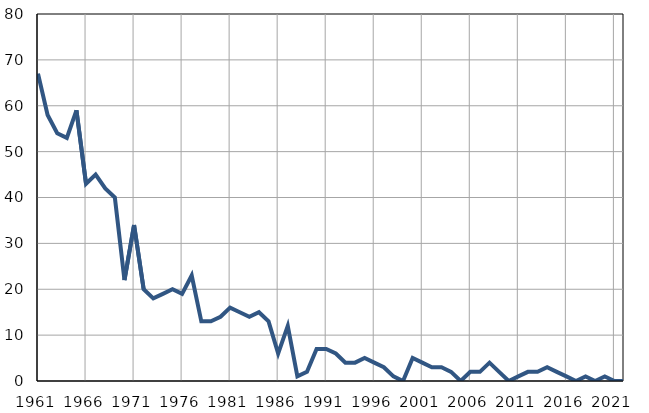
| Category | Infants
deaths |
|---|---|
| 1961.0 | 67 |
| 1962.0 | 58 |
| 1963.0 | 54 |
| 1964.0 | 53 |
| 1965.0 | 59 |
| 1966.0 | 43 |
| 1967.0 | 45 |
| 1968.0 | 42 |
| 1969.0 | 40 |
| 1970.0 | 22 |
| 1971.0 | 34 |
| 1972.0 | 20 |
| 1973.0 | 18 |
| 1974.0 | 19 |
| 1975.0 | 20 |
| 1976.0 | 19 |
| 1977.0 | 23 |
| 1978.0 | 13 |
| 1979.0 | 13 |
| 1980.0 | 14 |
| 1981.0 | 16 |
| 1982.0 | 15 |
| 1983.0 | 14 |
| 1984.0 | 15 |
| 1985.0 | 13 |
| 1986.0 | 6 |
| 1987.0 | 12 |
| 1988.0 | 1 |
| 1989.0 | 2 |
| 1990.0 | 7 |
| 1991.0 | 7 |
| 1992.0 | 6 |
| 1993.0 | 4 |
| 1994.0 | 4 |
| 1995.0 | 5 |
| 1996.0 | 4 |
| 1997.0 | 3 |
| 1998.0 | 1 |
| 1999.0 | 0 |
| 2000.0 | 5 |
| 2001.0 | 4 |
| 2002.0 | 3 |
| 2003.0 | 3 |
| 2004.0 | 2 |
| 2005.0 | 0 |
| 2006.0 | 2 |
| 2007.0 | 2 |
| 2008.0 | 4 |
| 2009.0 | 2 |
| 2010.0 | 0 |
| 2011.0 | 1 |
| 2012.0 | 2 |
| 2013.0 | 2 |
| 2014.0 | 3 |
| 2015.0 | 2 |
| 2016.0 | 1 |
| 2017.0 | 0 |
| 2018.0 | 1 |
| 2019.0 | 0 |
| 2020.0 | 1 |
| 2021.0 | 0 |
| 2022.0 | 0 |